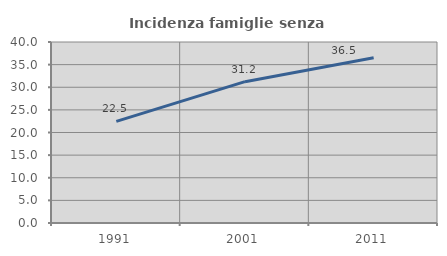
| Category | Incidenza famiglie senza nuclei |
|---|---|
| 1991.0 | 22.468 |
| 2001.0 | 31.235 |
| 2011.0 | 36.506 |